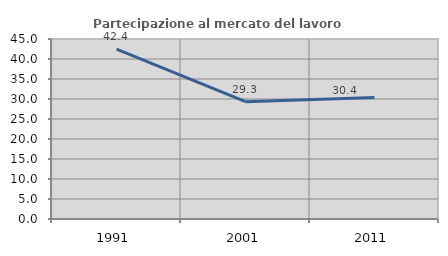
| Category | Partecipazione al mercato del lavoro  femminile |
|---|---|
| 1991.0 | 42.447 |
| 2001.0 | 29.329 |
| 2011.0 | 30.379 |